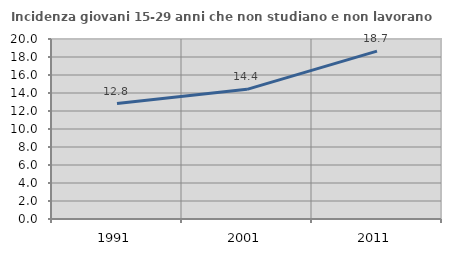
| Category | Incidenza giovani 15-29 anni che non studiano e non lavorano  |
|---|---|
| 1991.0 | 12.821 |
| 2001.0 | 14.405 |
| 2011.0 | 18.655 |